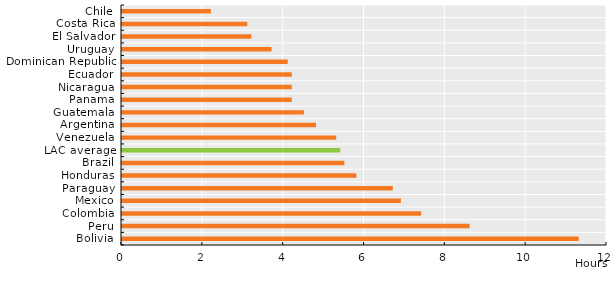
| Category | Series 0 |
|---|---|
| Bolivia | 11.3 |
| Peru | 8.6 |
| Colombia | 7.4 |
| Mexico | 6.9 |
| Paraguay | 6.7 |
| Honduras | 5.8 |
| Brazil | 5.5 |
| LAC average | 5.4 |
| Venezuela | 5.3 |
| Argentina | 4.8 |
| Guatemala | 4.5 |
| Panama | 4.2 |
| Nicaragua | 4.2 |
| Ecuador | 4.2 |
| Dominican Republic | 4.1 |
| Uruguay | 3.7 |
| El Salvador | 3.2 |
| Costa Rica | 3.1 |
| Chile | 2.2 |